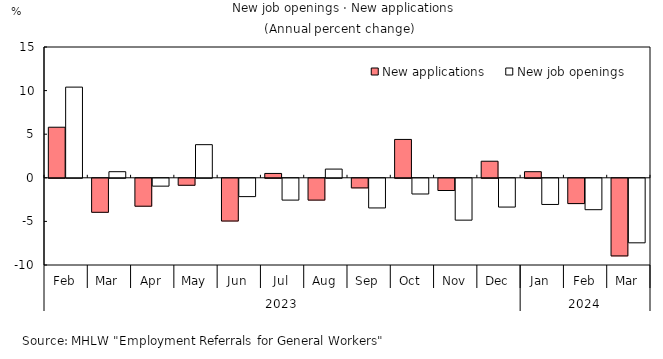
| Category | New applications | New job openings |
|---|---|---|
| 0 | 5.8 | 10.4 |
| 1 | -3.9 | 0.7 |
| 2 | -3.2 | -0.9 |
| 3 | -0.8 | 3.8 |
| 4 | -4.9 | -2.1 |
| 5 | 0.5 | -2.5 |
| 6 | -2.5 | 1 |
| 7 | -1.1 | -3.4 |
| 8 | 4.4 | -1.8 |
| 9 | -1.4 | -4.8 |
| 10 | 1.9 | -3.3 |
| 11 | 0.7 | -3 |
| 12 | -2.9 | -3.6 |
| 13 | -8.9 | -7.4 |